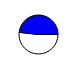
| Category | Series 0 |
|---|---|
| 0 | 10097009 |
| 1 | 9404043 |